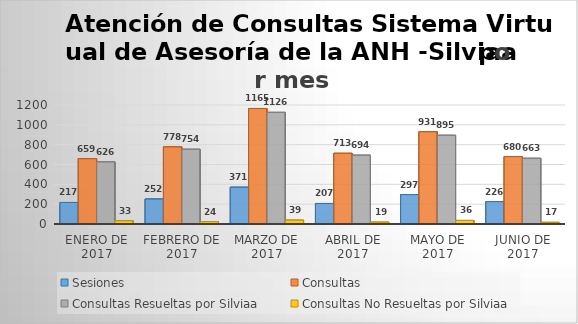
| Category | Sesiones | Consultas | Consultas Resueltas por Silviaa | Consultas No Resueltas por Silviaa |
|---|---|---|---|---|
| Enero de 2017 | 217 | 659 | 626 | 33 |
| Febrero de 2017 | 252 | 778 | 754 | 24 |
| Marzo de 2017 | 371 | 1165 | 1126 | 39 |
| Abril de 2017 | 207 | 713 | 694 | 19 |
| Mayo de 2017 | 297 | 931 | 895 | 36 |
| Junio de 2017 | 226 | 680 | 663 | 17 |